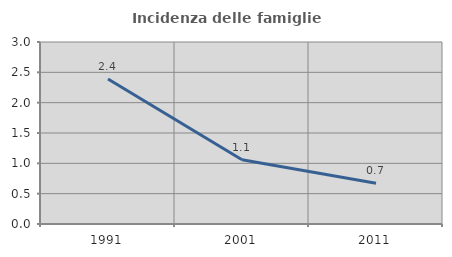
| Category | Incidenza delle famiglie numerose |
|---|---|
| 1991.0 | 2.39 |
| 2001.0 | 1.058 |
| 2011.0 | 0.673 |